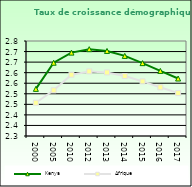
| Category | Kenya | Afrique                        |
|---|---|---|
| 2000.0 | 2.523 | 2.458 |
| 2005.0 | 2.647 | 2.516 |
| 2010.0 | 2.695 | 2.59 |
| 2012.0 | 2.711 | 2.606 |
| 2013.0 | 2.703 | 2.601 |
| 2014.0 | 2.679 | 2.584 |
| 2015.0 | 2.645 | 2.559 |
| 2016.0 | 2.608 | 2.531 |
| 2017.0 | 2.572 | 2.503 |